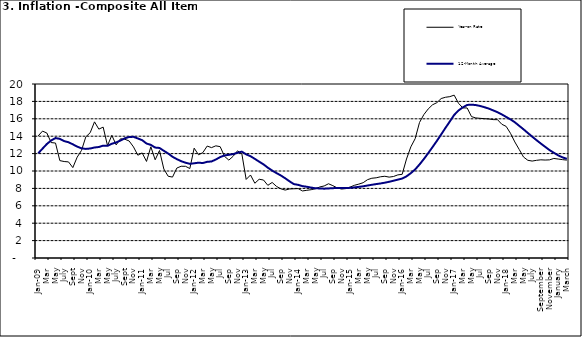
| Category | Year-on Rate | 12-Month Average |
|---|---|---|
| Jan-09 | 14.034 | 12.032 |
| Feb | 14.584 | 12.567 |
| Mar | 14.366 | 13.101 |
| Apr | 13.268 | 13.51 |
| May | 13.212 | 13.787 |
| June | 11.194 | 13.694 |
| July | 11.09 | 13.437 |
| Aug | 11.046 | 13.307 |
| Sept | 10.39 | 13.065 |
| Oct | 11.588 | 12.803 |
| Nov | 12.368 | 12.609 |
| Dec | 13.93 | 12.538 |
| Jan-10 | 14.398 | 12.586 |
| Feb | 15.649 | 12.7 |
| Mar | 14.812 | 12.757 |
| Apr | 15.044 | 12.915 |
| May | 12.915 | 12.893 |
| June | 14.099 | 13.132 |
| July | 13.002 | 13.284 |
| Aug | 13.702 | 13.5 |
| Sept | 13.65 | 13.764 |
| Oct | 13.45 | 13.908 |
| Nov | 12.766 | 13.928 |
| Dec | 11.815 | 13.74 |
| Jan-11 | 12.08 | 13.542 |
| Feb | 11.1 | 13.161 |
| Mar | 12.779 | 13.001 |
| Apr | 11.291 | 12.694 |
| May | 12.352 | 12.648 |
| Jun | 10.23 | 12.321 |
| Jul | 9.397 | 12.009 |
| Aug | 9.301 | 11.635 |
| Sep | 10.339 | 11.363 |
| Oct | 10.544 | 11.13 |
| Nov | 10.54 | 10.952 |
| Dec | 10.283 | 10.826 |
| Jan-12 | 12.626 | 10.886 |
| Feb | 11.866 | 10.955 |
| Mar | 12.111 | 10.914 |
| Apr | 12.866 | 11.054 |
| May | 12.688 | 11.096 |
| Jun | 12.892 | 11.32 |
| Jul | 12.797 | 11.599 |
| Aug | 11.689 | 11.791 |
| Sep | 11.253 | 11.859 |
| Oct | 11.693 | 11.948 |
| Nov | 12.32 | 12.091 |
| Dec | 11.981 | 12.224 |
| Jan-13 | 9.031 | 11.908 |
| Feb | 9.542 | 11.703 |
| Mar | 8.593 | 11.394 |
| Apr | 9.052 | 11.072 |
| May | 8.964 | 10.761 |
| Jun | 8.353 | 10.383 |
| Jul | 8.682 | 10.047 |
| Aug | 8.231 | 9.761 |
| Sep | 7.952 | 9.486 |
| Oct | 7.807 | 9.167 |
| Nov | 7.931 | 8.815 |
| Dec | 7.957 | 8.496 |
| Jan-14 | 7.977 | 8.408 |
| Feb | 7.707 | 8.257 |
| Mar | 7.783 | 8.19 |
| Apr | 7.851 | 8.092 |
| May | 7.965 | 8.012 |
| Jun | 8.167 | 7.998 |
| Jul | 8.281 | 7.968 |
| Aug | 8.534 | 7.996 |
| Sep | 8.317 | 8.027 |
| Oct | 8.06 | 8.047 |
| Nov | 7.927 | 8.046 |
| Dec | 7.978 | 8.047 |
| Jan-15 | 8.157 | 8.063 |
| Feb | 8.359 | 8.117 |
| Mar | 8.494 | 8.176 |
| Apr | 8.655 | 8.243 |
| May | 9.003 | 8.331 |
| Jun | 9.168 | 8.417 |
| Jul | 9.218 | 8.497 |
| Aug | 9.336 | 8.566 |
| Sep | 9.394 | 8.658 |
| Oct | 9.296 | 8.76 |
| Nov | 9.368 | 8.879 |
| Dec | 9.554 | 9.009 |
| Jan-16 | 9.617 | 9.13 |
| Feb | 11.379 | 9.386 |
| Mar | 12.775 | 9.751 |
| Apr | 13.721 | 10.182 |
| May | 15.577 | 10.746 |
| Jun | 16.48 | 11.372 |
| Jul | 17.127 | 12.045 |
| Aug | 17.609 | 12.744 |
| Sep | 17.852 | 13.454 |
| Oct | 18.33 | 14.206 |
| Nov | 18.476 | 14.958 |
| Dec | 18.547 | 15.697 |
| Jan-17 | 18.719 | 16.441 |
| Feb | 17.78 | 16.958 |
| Mar | 17.256 | 17.315 |
| Apr | 17.244 | 17.591 |
| May | 16.251 | 17.628 |
| Jun | 16.098 | 17.578 |
| Jul | 16.053 | 17.475 |
| Aug | 16.012 | 17.331 |
| Sep | 15.979 | 17.17 |
| Oct | 15.905 | 16.968 |
| Nov | 15.901 | 16.76 |
| Dec | 15.372 | 16.502 |
| Jan-18 | 15.127 | 16.215 |
| Feb | 14.33 | 15.93 |
| Mar | 13.337 | 15.599 |
| Apr | 12.482 | 15.196 |
| May | 11.608 | 14.793 |
| June | 11.231 | 14.371 |
| July | 11.142 | 13.95 |
| August | 11.227 | 13.546 |
| September | 11.284 | 13.157 |
| October | 11.259 | 12.777 |
| November | 11.281 | 12.406 |
| December | 11.442 | 12.095 |
| January | 11.374 | 11.801 |
| February | 11.306 | 11.564 |
| March | 11.251 | 11.401 |